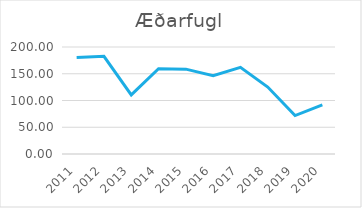
| Category | Æðarfugl |
|---|---|
| 2011.0 | 180.555 |
| 2012.0 | 182.606 |
| 2013.0 | 110.48 |
| 2014.0 | 159.314 |
| 2015.0 | 158.627 |
| 2016.0 | 146.162 |
| 2017.0 | 161.888 |
| 2018.0 | 125.139 |
| 2019.0 | 71.866 |
| 2020.0 | 91.72 |